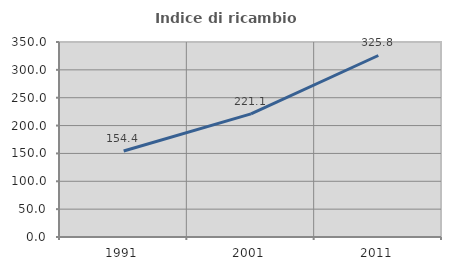
| Category | Indice di ricambio occupazionale  |
|---|---|
| 1991.0 | 154.434 |
| 2001.0 | 221.091 |
| 2011.0 | 325.773 |